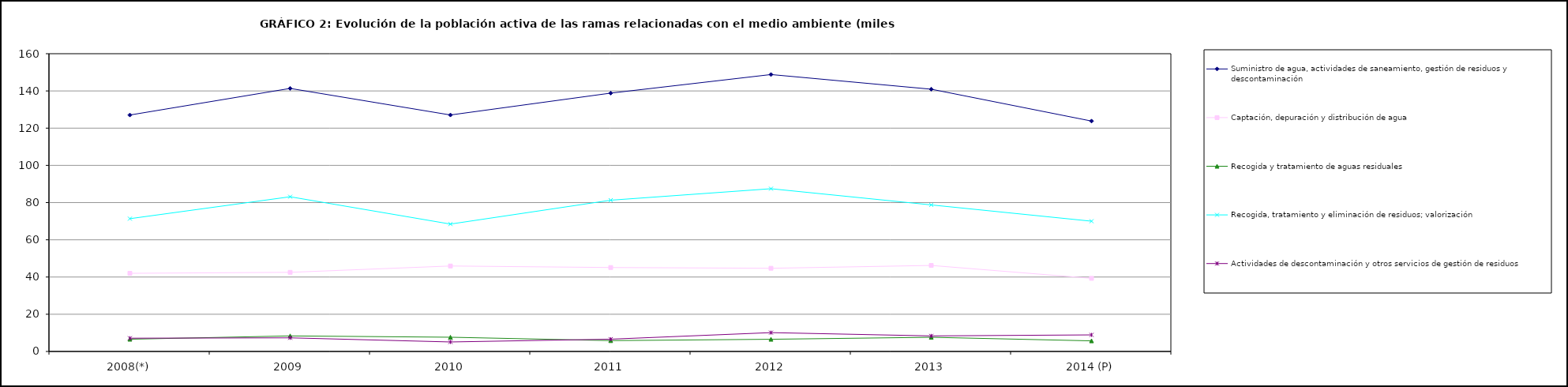
| Category | Suministro de agua, actividades de saneamiento, gestión de residuos y descontaminación  | Captación, depuración y distribución de agua         | Recogida y tratamiento de aguas residuales                                                                                 | Recogida, tratamiento y eliminación de residuos; valorización       | Actividades de descontaminación y otros servicios de gestión de residuos  |
|---|---|---|---|---|---|
| 2008(*) | 127.05 | 42 | 6.575 | 71.35 | 7.125 |
| 2009 | 141.35 | 42.525 | 8.35 | 83.125 | 7.325 |
| 2010 | 127.075 | 45.925 | 7.65 | 68.45 | 5.1 |
| 2011 | 138.825 | 45.1 | 5.825 | 81.275 | 6.6 |
| 2012 | 148.8 | 44.7 | 6.55 | 87.45 | 10.125 |
| 2013 | 140.925 | 46.225 | 7.625 | 78.75 | 8.35 |
| 2014 (P) | 123.8 | 39.3 | 5.7 | 70 | 8.9 |